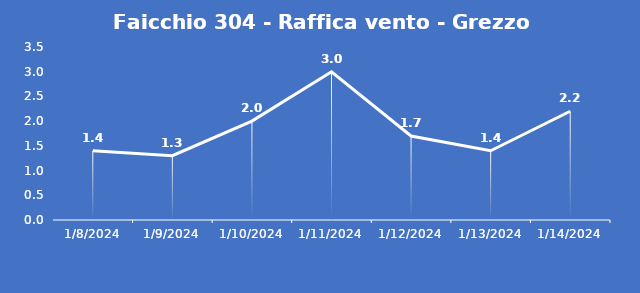
| Category | Faicchio 304 - Raffica vento - Grezzo (m/s) |
|---|---|
| 1/8/24 | 1.4 |
| 1/9/24 | 1.3 |
| 1/10/24 | 2 |
| 1/11/24 | 3 |
| 1/12/24 | 1.7 |
| 1/13/24 | 1.4 |
| 1/14/24 | 2.2 |